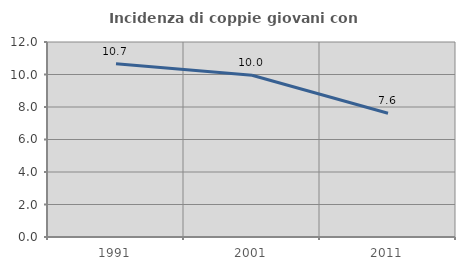
| Category | Incidenza di coppie giovani con figli |
|---|---|
| 1991.0 | 10.667 |
| 2001.0 | 9.953 |
| 2011.0 | 7.612 |